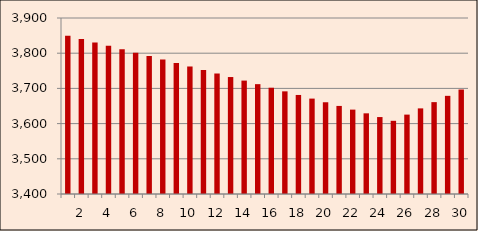
| Category | Series 0 |
|---|---|
| nan | 3849.564 |
| 2.0 | 3840.05 |
| nan | 3830.489 |
| 4.0 | 3820.882 |
| nan | 3811.228 |
| 6.0 | 3801.526 |
| nan | 3791.778 |
| 8.0 | 3781.982 |
| nan | 3772.138 |
| 10.0 | 3762.246 |
| nan | 3752.305 |
| 12.0 | 3742.317 |
| nan | 3732.279 |
| 14.0 | 3722.193 |
| nan | 3712.057 |
| 16.0 | 3701.872 |
| nan | 3691.637 |
| 18.0 | 3681.352 |
| nan | 3671.018 |
| 20.0 | 3660.632 |
| nan | 3650.196 |
| 22.0 | 3639.709 |
| nan | 3629.171 |
| 24.0 | 3618.582 |
| nan | 3607.941 |
| 26.0 | 3625.541 |
| nan | 3643.226 |
| 28.0 | 3660.998 |
| nan | 3678.857 |
| 30.0 | 3696.802 |